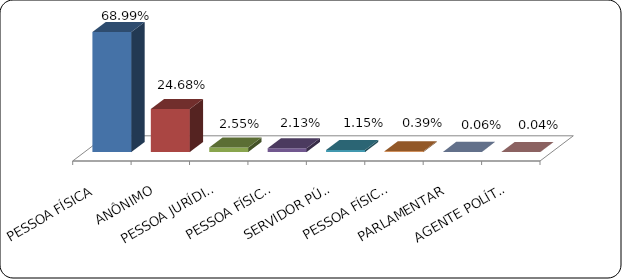
| Category | Series 0 |
|---|---|
|      PESSOA FÍSICA | 0.69 |
|      ANÔNIMO | 0.247 |
|      PESSOA JURÍDICA | 0.025 |
|      PESSOA FÍSICA ACIMA DE 60 ANOS | 0.021 |
|      SERVIDOR PÚBLICO | 0.012 |
|      PESSOA FÍSICA ACIMA DE 80 ANOS | 0.004 |
|      PARLAMENTAR | 0.001 |
|      AGENTE POLÍTICO | 0 |